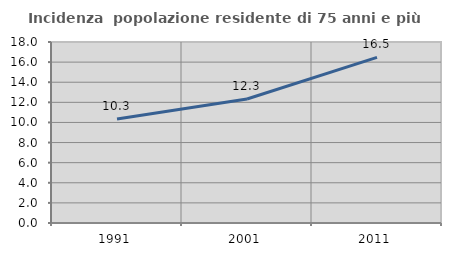
| Category | Incidenza  popolazione residente di 75 anni e più |
|---|---|
| 1991.0 | 10.342 |
| 2001.0 | 12.332 |
| 2011.0 | 16.469 |